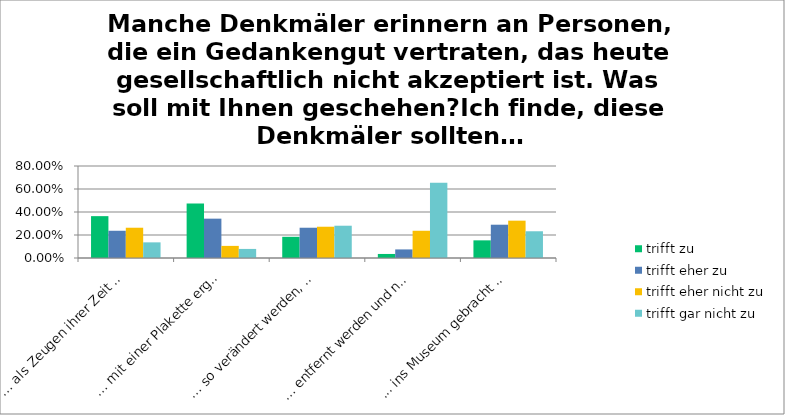
| Category | trifft zu | trifft eher zu | trifft eher nicht zu | trifft gar nicht zu |
|---|---|---|---|---|
| … als Zeugen ihrer Zeit unverändert stehenbleiben. | 0.364 | 0.237 | 0.263 | 0.136 |
| … mit einer Plakette ergänzt werden, welche die Problematik erklärt. | 0.474 | 0.342 | 0.105 | 0.079 |
| … so verändert werden, dass die Problematik klar ersichtlich wird (zum Beispiel durch ein Gegendenkmal). | 0.184 | 0.263 | 0.272 | 0.281 |
| … entfernt werden und nicht mehr öffentlich zugänglich sein. | 0.035 | 0.075 | 0.237 | 0.654 |
| ... ins Museum gebracht und dort erklärt werden. | 0.154 | 0.29 | 0.325 | 0.232 |